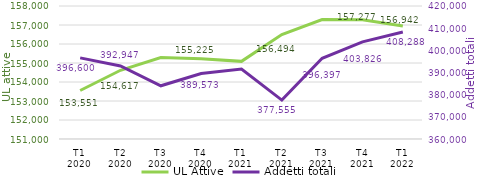
| Category | UL Attive |
|---|---|
| T1
2020 | 153551 |
| T2
2020 | 154617 |
| T3
2020 | 155283 |
| T4
2020 | 155225 |
| T1
2021 | 155087 |
| T2
2021 | 156494 |
| T3
2021 | 157291 |
| T4
2021 | 157277 |
| T1
2022 | 156942 |